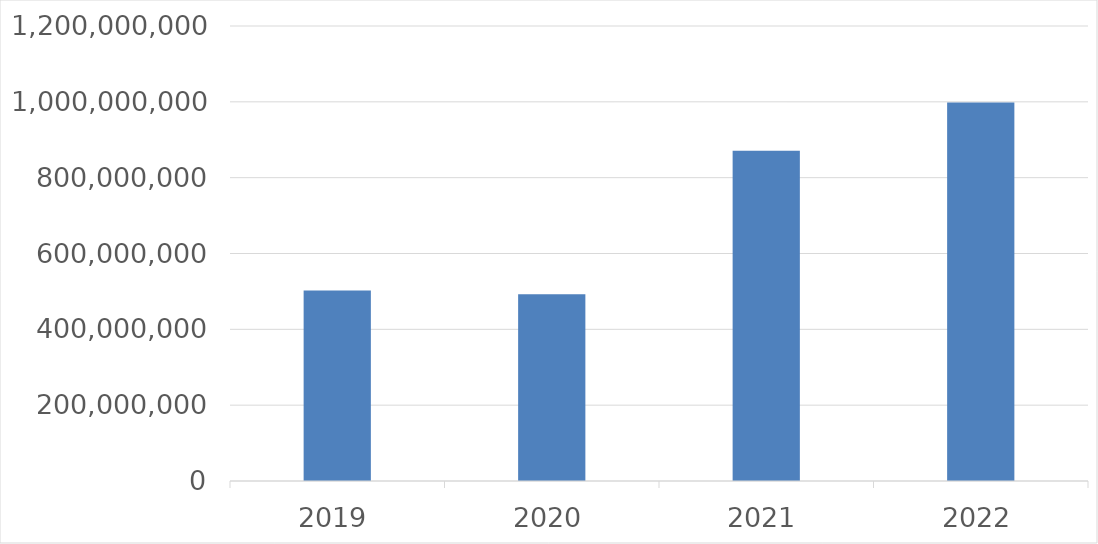
| Category | Series 0 |
|---|---|
| 2019 | 502232993 |
| 2020 | 492673536 |
| 2021 | 871152419 |
| 2022 | 998175134 |